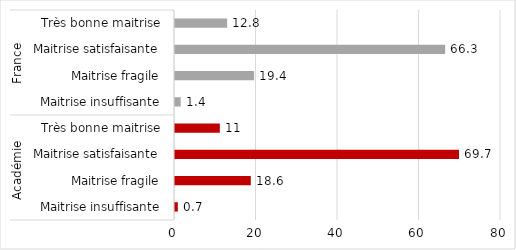
| Category | Series 0 |
|---|---|
| 0 | 0.7 |
| 1 | 18.6 |
| 2 | 69.7 |
| 3 | 11 |
| 4 | 1.4 |
| 5 | 19.4 |
| 6 | 66.3 |
| 7 | 12.8 |